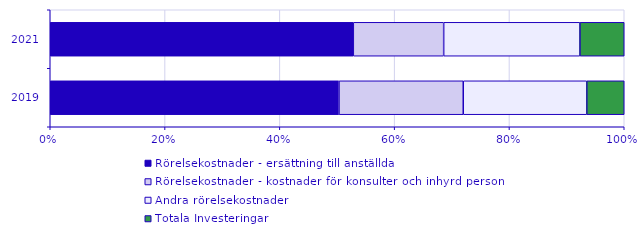
| Category | Rörelsekostnader - ersättning till anställda | Rörelsekostnader - kostnader för konsulter och inhyrd personal | Andra rörelsekostnader | Totala Investeringar  |
|---|---|---|---|---|
| 2019 | 64778.502 | 27879.807 | 27714.968 | 8402.58 |
| 2021 | 69450 | 20712 | 31225 | 10154 |